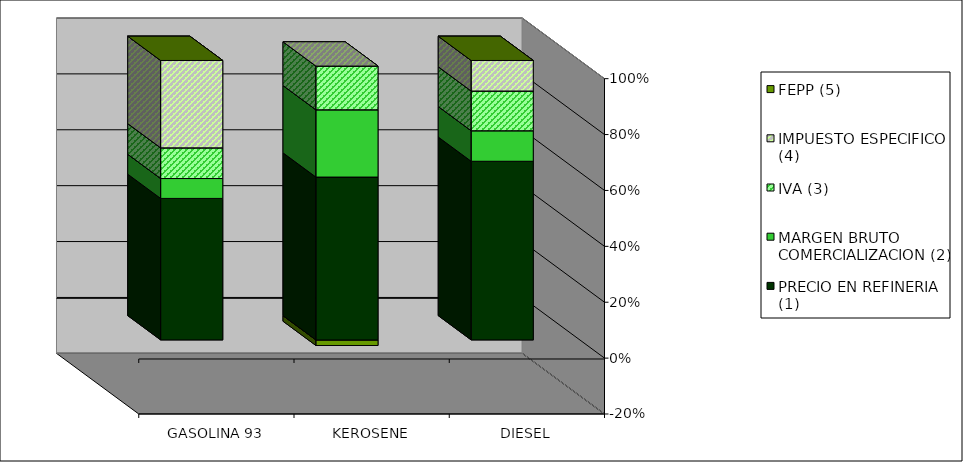
| Category | PRECIO EN REFINERIA (1) | MARGEN BRUTO COMERCIALIZACION (2) | IVA (3) | IMPUESTO ESPECIFICO (4) | FEPP (5) |
|---|---|---|---|---|---|
| GASOLINA 93 | 0.506 | 0.071 | 0.11 | 0.313 | 0 |
| KEROSENE | 0.607 | 0.251 | 0.163 | 0 | -0.021 |
| DIESEL | 0.639 | 0.109 | 0.142 | 0.109 | 0 |